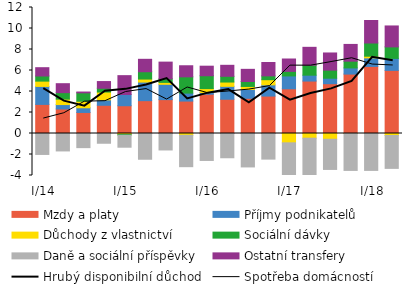
| Category | Mzdy a platy | Příjmy podnikatelů | Důchody z vlastnictví | Sociální dávky  | Daně a sociální příspěvky | Ostatní transfery |
|---|---|---|---|---|---|---|
|  I/14 | 2.771 | 1.713 | 0.504 | 0.489 | -1.995 | 0.791 |
| II | 2.338 | 0.418 | 0.516 | 0.619 | -1.661 | 0.853 |
| III | 2.003 | 0.446 | 0.622 | 0.801 | -1.346 | 0.078 |
| IV | 2.689 | 0.515 | 0.744 | 0.361 | -0.929 | 0.639 |
|  I/15 | 2.644 | 1.067 | -0.091 | -0.068 | -1.147 | 1.798 |
| II | 3.127 | 1.772 | 0.285 | 0.699 | -2.453 | 1.182 |
| III | 3.227 | 1.458 | 0.18 | 0.346 | -1.568 | 1.587 |
| IV | 3.087 | 0.757 | -0.172 | 1.551 | -2.987 | 1.055 |
|  I/16 | 3.741 | 0.163 | 0.374 | 1.222 | -2.567 | 0.911 |
| II | 3.262 | 1.228 | 0.411 | 0.546 | -2.311 | 1.047 |
| III | 3.352 | 0.842 | 0.288 | 0.473 | -3.184 | 1.156 |
| IV | 3.566 | 1.066 | 0.492 | 0.365 | -2.44 | 1.271 |
|  I/17 | 4.259 | 1.223 | -0.888 | 0.435 | -3.025 | 1.178 |
| II | 4.994 | 0.559 | -0.446 | 0.949 | -3.959 | 1.705 |
| III | 4.742 | 0.522 | -0.547 | 0.769 | -2.875 | 1.636 |
| IV | 5.66 | 0.585 | -0.003 | 0.643 | -3.514 | 1.596 |
|  I/18 | 6.391 | 0.812 | 0.159 | 1.257 | -3.515 | 2.146 |
| II | 6.011 | 1.141 | -0.191 | 1.097 | -3.132 | 1.993 |